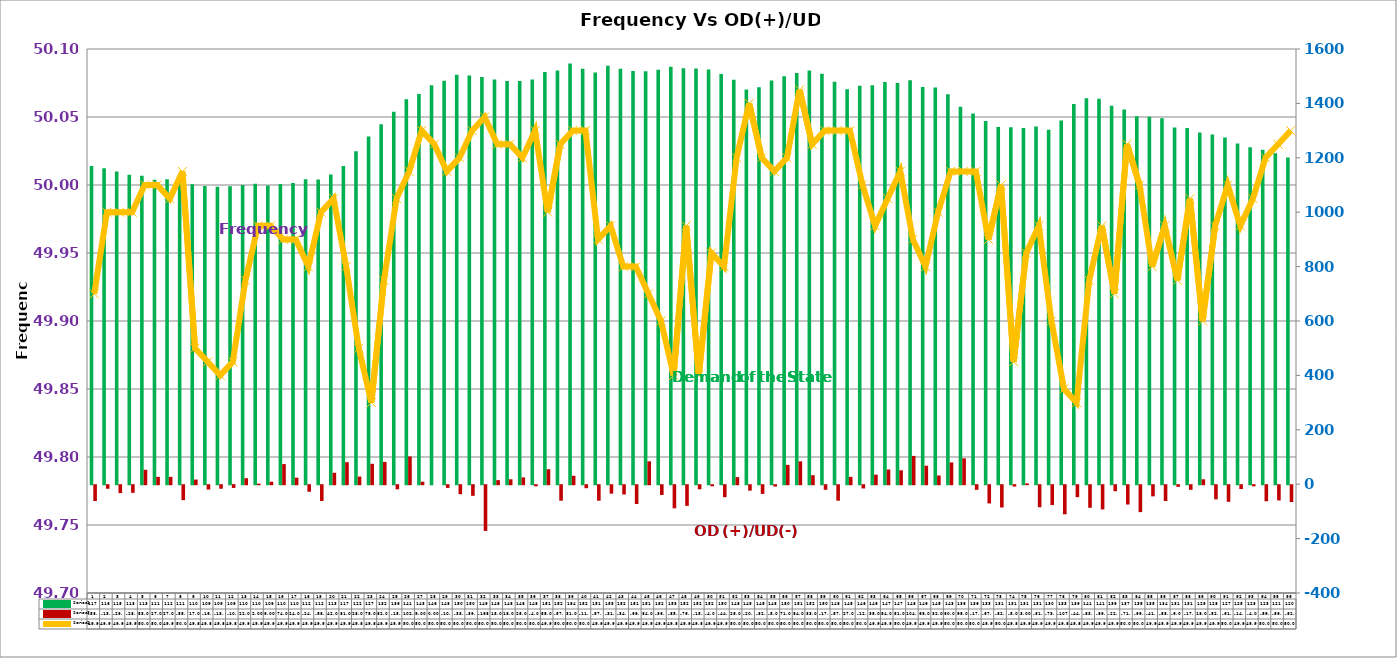
| Category | Series 2 | Series 4 |
|---|---|---|
| 0 | 1170 | -58 |
| 1 | 1162 | -13 |
| 2 | 1150 | -29 |
| 3 | 1138 | -28 |
| 4 | 1134 | 53 |
| 5 | 1119 | 27 |
| 6 | 1121 | 27 |
| 7 | 1116 | -55 |
| 8 | 1103 | 17 |
| 9 | 1096 | -16 |
| 10 | 1094 | -13 |
| 11 | 1095 | -10 |
| 12 | 1100 | 22 |
| 13 | 1105 | 2 |
| 14 | 1098 | 9 |
| 15 | 1104 | 74 |
| 16 | 1107 | 24 |
| 17 | 1121 | -24 |
| 18 | 1120 | -58 |
| 19 | 1139 | 42 |
| 20 | 1170 | 81 |
| 21 | 1224 | 28 |
| 22 | 1278 | 75 |
| 23 | 1323 | 82 |
| 24 | 1369 | -15 |
| 25 | 1415 | 102 |
| 26 | 1435 | 9 |
| 27 | 1467 | 0 |
| 28 | 1483 | -10 |
| 29 | 1505 | -33 |
| 30 | 1503 | -39 |
| 31 | 1497 | -168 |
| 32 | 1488 | 15 |
| 33 | 1482 | 18 |
| 34 | 1482 | 25 |
| 35 | 1488 | -4 |
| 36 | 1515 | 55 |
| 37 | 1521 | -57 |
| 38 | 1547 | 31 |
| 39 | 1527 | -11 |
| 40 | 1514 | -57 |
| 41 | 1538 | -31 |
| 42 | 1527 | -34 |
| 43 | 1519 | -69 |
| 44 | 1518 | 84 |
| 45 | 1524 | -36 |
| 46 | 1535 | -85 |
| 47 | 1529 | -76 |
| 48 | 1528 | -15 |
| 49 | 1525 | -4 |
| 50 | 1508 | -44 |
| 51 | 1487 | 26 |
| 52 | 1451 | -20 |
| 53 | 1459 | -32 |
| 54 | 1484 | -5 |
| 55 | 1500 | 71 |
| 56 | 1512 | 84 |
| 57 | 1521 | 33 |
| 58 | 1509 | -17 |
| 59 | 1480 | -57 |
| 60 | 1452 | 27 |
| 61 | 1465 | -12 |
| 62 | 1467 | 35 |
| 63 | 1479 | 54 |
| 64 | 1475 | 51 |
| 65 | 1485 | 104 |
| 66 | 1460 | 68 |
| 67 | 1458 | 32 |
| 68 | 1434 | 80 |
| 69 | 1388 | 95 |
| 70 | 1363 | -17 |
| 71 | 1335 | -67 |
| 72 | 1313 | -82 |
| 73 | 1312 | -5 |
| 74 | 1310 | 3 |
| 75 | 1315 | -81 |
| 76 | 1303 | -73 |
| 77 | 1337 | -107 |
| 78 | 1398 | -44 |
| 79 | 1419 | -83 |
| 80 | 1417 | -89 |
| 81 | 1391 | -22 |
| 82 | 1378 | -71 |
| 83 | 1353 | -99 |
| 84 | 1351 | -41 |
| 85 | 1345 | -58 |
| 86 | 1311 | -6 |
| 87 | 1310 | -17 |
| 88 | 1293 | 18 |
| 89 | 1286 | -52 |
| 90 | 1275 | -61 |
| 91 | 1253 | -14 |
| 92 | 1239 | -4 |
| 93 | 1230 | -59 |
| 94 | 1217 | -56 |
| 95 | 1201 | -62 |